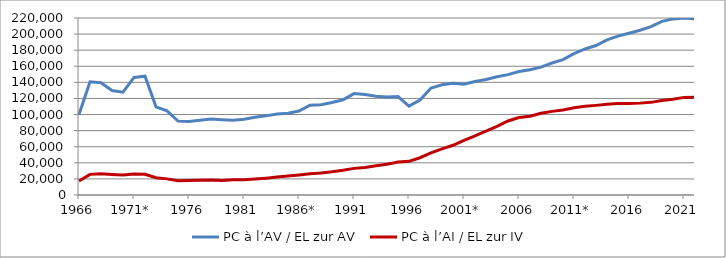
| Category | PC à l’AV / EL zur AV | PC à l’AI / EL zur IV |
|---|---|---|
| 1966 | 100015 | 17294 |
| 1967 | 140641 | 25640 |
| 1968 | 139488 | 26401 |
| 1969 | 129807 | 25466 |
| 1970 | 127725 | 24745 |
| 1971* | 146187 | 26199 |
| 1972 | 147666 | 25734 |
| 1973* | 109591 | 21495 |
| 1974 | 104547 | 20037 |
| 1975* | 91796 | 17788 |
| 1976 | 91217 | 17928 |
| 1977* | 92976 | 18206 |
| 1978 | 94355 | 18652 |
| 1979 | 93672 | 18020 |
| 1980* | 93061 | 18891 |
| 1981 | 94240 | 18950 |
| 1982* | 96686 | 19798 |
| 1983 | 98366 | 20934 |
| 1984* | 100573 | 22363 |
| 1985 | 101536 | 23576 |
| 1986* | 104339 | 24904 |
| 1987 | 111594 | 26515 |
| 1988* | 112232 | 27346 |
| 1989 | 115042 | 28805 |
| 1990* | 118286 | 30695 |
| 1991 | 126050 | 33097 |
| 1992* | 124900 | 34230 |
| 1993* | 122664 | 36297 |
| 1994 | 121772 | 38204 |
| 1995* | 122291 | 40876 |
| 1996 | 110409 | 41806 |
| 1997* | 117928 | 46331 |
| 1998* | 132931 | 52263 |
| 1999* | 137045 | 57377 |
| 2000 | 138894 | 61817 |
| 2001* | 137698 | 67800 |
| 2002 | 141076 | 73555 |
| 2003* | 143628 | 79282 |
| 2004 | 146910 | 85370 |
| 2005* | 149586 | 92001 |
| 2006 | 153537 | 96281 |
| 2007* | 155617 | 97915 |
| 2008 | 158969 | 101535 |
| 2009* | 164078 | 103943 |
| 2010 | 168206 | 105596 |
| 2011* | 175671 | 108536 |
| 2012 | 181493 | 110179 |
| 2013* | 185770 | 111400 |
| 2014 | 192856 | 112864 |
| 2015* | 197417 | 113858 |
| 2016 | 201056 | 113708 |
| 2017 | 204768 | 114194 |
| 2018 | 209190 | 115140 |
| 2019* | 215772 | 117498 |
| 2020 | 218903 | 119090 |
| 2021 | 219935 | 121326 |
| 2022 | 219109 | 121556 |